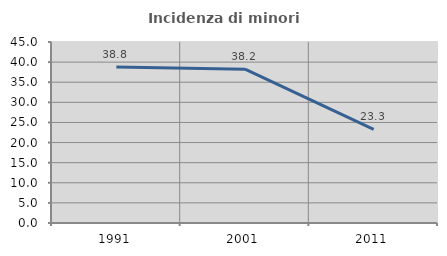
| Category | Incidenza di minori stranieri |
|---|---|
| 1991.0 | 38.776 |
| 2001.0 | 38.235 |
| 2011.0 | 23.295 |